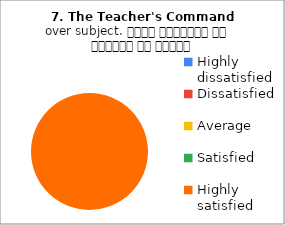
| Category | 7. The Teacher's Command over subject. विषय अवधारणा पर शिक्षक का ज्ञान |
|---|---|
| Highly dissatisfied | 0 |
| Dissatisfied | 0 |
| Average | 0 |
| Satisfied | 0 |
| Highly satisfied | 5 |